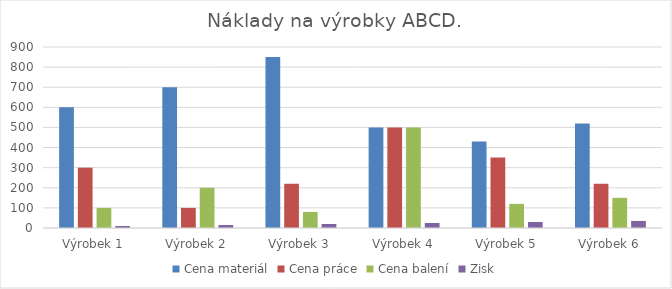
| Category | Cena materiál | Cena práce | Cena balení | Zisk |
|---|---|---|---|---|
| Výrobek 1 | 600 | 300 | 100 | 10 |
| Výrobek 2 | 700 | 100 | 200 | 15 |
| Výrobek 3 | 850 | 220 | 80 | 20 |
| Výrobek 4 | 500 | 500 | 500 | 25 |
| Výrobek 5 | 430 | 350 | 120 | 30 |
| Výrobek 6 | 520 | 220 | 150 | 35 |